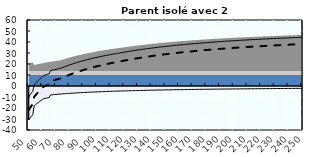
| Category | Coin fiscal moyen (somme des composantes) | Taux moyen d'imposition net en % du salaire brut |
|---|---|---|
| 50.0 | -9.884 | -22.027 |
| 51.0 | -8.051 | -19.991 |
| 52.0 | -6.288 | -18.033 |
| 53.0 | -4.807 | -16.388 |
| 54.0 | 1.073 | -9.859 |
| 55.0 | 2.403 | -8.381 |
| 56.0 | 3.686 | -6.957 |
| 57.0 | 4.924 | -5.582 |
| 58.0 | 6.119 | -4.255 |
| 59.0 | 7.274 | -2.973 |
| 60.0 | 8.39 | -1.733 |
| 61.0 | 9.47 | -0.534 |
| 62.0 | 10.026 | 0.084 |
| 63.0 | 10.432 | 0.535 |
| 64.0 | 10.825 | 0.972 |
| 65.0 | 11.207 | 1.395 |
| 66.0 | 13.945 | 4.436 |
| 67.0 | 14.269 | 4.796 |
| 68.0 | 14.583 | 5.144 |
| 69.0 | 14.888 | 5.483 |
| 70.0 | 15.184 | 5.811 |
| 71.0 | 15.471 | 6.131 |
| 72.0 | 15.751 | 6.442 |
| 73.0 | 16.023 | 6.744 |
| 74.0 | 16.42 | 7.185 |
| 75.0 | 16.916 | 7.736 |
| 76.0 | 17.399 | 8.272 |
| 77.0 | 17.87 | 8.794 |
| 78.0 | 18.328 | 9.303 |
| 79.0 | 18.775 | 9.8 |
| 80.0 | 19.211 | 10.283 |
| 81.0 | 19.635 | 10.755 |
| 82.0 | 20.05 | 11.215 |
| 83.0 | 20.454 | 11.665 |
| 84.0 | 20.849 | 12.103 |
| 85.0 | 21.235 | 12.531 |
| 86.0 | 21.612 | 12.95 |
| 87.0 | 21.98 | 13.358 |
| 88.0 | 22.339 | 13.758 |
| 89.0 | 22.691 | 14.148 |
| 90.0 | 23.034 | 14.53 |
| 91.0 | 23.371 | 14.903 |
| 92.0 | 23.699 | 15.268 |
| 93.0 | 24.021 | 15.625 |
| 94.0 | 24.336 | 15.975 |
| 95.0 | 24.644 | 16.318 |
| 96.0 | 24.946 | 16.653 |
| 97.0 | 25.242 | 16.981 |
| 98.0 | 25.532 | 17.303 |
| 99.0 | 25.815 | 17.618 |
| 100.0 | 26.093 | 17.927 |
| 101.0 | 26.366 | 18.229 |
| 102.0 | 26.633 | 18.526 |
| 103.0 | 26.895 | 18.817 |
| 104.0 | 27.152 | 19.103 |
| 105.0 | 27.404 | 19.383 |
| 106.0 | 27.652 | 19.657 |
| 107.0 | 27.894 | 19.927 |
| 108.0 | 28.133 | 20.191 |
| 109.0 | 28.367 | 20.451 |
| 110.0 | 28.596 | 20.706 |
| 111.0 | 28.822 | 20.956 |
| 112.0 | 29.043 | 21.202 |
| 113.0 | 29.261 | 21.444 |
| 114.0 | 29.474 | 21.681 |
| 115.0 | 29.684 | 21.915 |
| 116.0 | 29.891 | 22.144 |
| 117.0 | 30.095 | 22.371 |
| 118.0 | 30.321 | 22.622 |
| 119.0 | 30.544 | 22.869 |
| 120.0 | 30.762 | 23.112 |
| 121.0 | 30.977 | 23.35 |
| 122.0 | 31.189 | 23.585 |
| 123.0 | 31.397 | 23.816 |
| 124.0 | 31.602 | 24.043 |
| 125.0 | 31.803 | 24.267 |
| 126.0 | 32.001 | 24.487 |
| 127.0 | 32.196 | 24.704 |
| 128.0 | 32.388 | 24.917 |
| 129.0 | 32.577 | 25.127 |
| 130.0 | 32.763 | 25.334 |
| 131.0 | 32.947 | 25.537 |
| 132.0 | 33.127 | 25.738 |
| 133.0 | 33.305 | 25.935 |
| 134.0 | 33.48 | 26.13 |
| 135.0 | 33.653 | 26.321 |
| 136.0 | 33.823 | 26.51 |
| 137.0 | 33.99 | 26.696 |
| 138.0 | 34.155 | 26.88 |
| 139.0 | 34.318 | 27.06 |
| 140.0 | 34.479 | 27.239 |
| 141.0 | 34.637 | 27.414 |
| 142.0 | 34.793 | 27.587 |
| 143.0 | 34.946 | 27.758 |
| 144.0 | 35.098 | 27.926 |
| 145.0 | 35.248 | 28.092 |
| 146.0 | 35.395 | 28.256 |
| 147.0 | 35.54 | 28.418 |
| 148.0 | 35.684 | 28.577 |
| 149.0 | 35.825 | 28.734 |
| 150.0 | 35.965 | 28.889 |
| 151.0 | 36.103 | 29.042 |
| 152.0 | 36.239 | 29.193 |
| 153.0 | 36.373 | 29.342 |
| 154.0 | 36.506 | 29.49 |
| 155.0 | 36.636 | 29.635 |
| 156.0 | 36.766 | 29.778 |
| 157.0 | 36.893 | 29.92 |
| 158.0 | 37.019 | 30.059 |
| 159.0 | 37.143 | 30.197 |
| 160.0 | 37.266 | 30.334 |
| 161.0 | 37.387 | 30.468 |
| 162.0 | 37.507 | 30.601 |
| 163.0 | 37.625 | 30.732 |
| 164.0 | 37.742 | 30.862 |
| 165.0 | 37.857 | 30.99 |
| 166.0 | 37.971 | 31.117 |
| 167.0 | 38.084 | 31.242 |
| 168.0 | 38.195 | 31.365 |
| 169.0 | 38.305 | 31.488 |
| 170.0 | 38.414 | 31.608 |
| 171.0 | 38.521 | 31.727 |
| 172.0 | 38.627 | 31.845 |
| 173.0 | 38.732 | 31.962 |
| 174.0 | 38.836 | 32.077 |
| 175.0 | 38.938 | 32.191 |
| 176.0 | 39.04 | 32.303 |
| 177.0 | 39.14 | 32.415 |
| 178.0 | 39.239 | 32.525 |
| 179.0 | 39.337 | 32.633 |
| 180.0 | 39.434 | 32.741 |
| 181.0 | 39.529 | 32.847 |
| 182.0 | 39.624 | 32.953 |
| 183.0 | 39.718 | 33.057 |
| 184.0 | 39.811 | 33.16 |
| 185.0 | 39.902 | 33.262 |
| 186.0 | 39.993 | 33.362 |
| 187.0 | 40.083 | 33.462 |
| 188.0 | 40.172 | 33.561 |
| 189.0 | 40.259 | 33.658 |
| 190.0 | 40.346 | 33.755 |
| 191.0 | 40.432 | 33.85 |
| 192.0 | 40.518 | 33.945 |
| 193.0 | 40.602 | 34.038 |
| 194.0 | 40.685 | 34.131 |
| 195.0 | 40.768 | 34.223 |
| 196.0 | 40.849 | 34.313 |
| 197.0 | 40.93 | 34.403 |
| 198.0 | 41.01 | 34.492 |
| 199.0 | 41.089 | 34.58 |
| 200.0 | 41.168 | 34.667 |
| 201.0 | 41.246 | 34.753 |
| 202.0 | 41.322 | 34.839 |
| 203.0 | 41.399 | 34.923 |
| 204.0 | 41.474 | 35.007 |
| 205.0 | 41.549 | 35.09 |
| 206.0 | 41.623 | 35.172 |
| 207.0 | 41.696 | 35.253 |
| 208.0 | 41.768 | 35.334 |
| 209.0 | 41.84 | 35.413 |
| 210.0 | 41.911 | 35.492 |
| 211.0 | 41.982 | 35.571 |
| 212.0 | 42.051 | 35.648 |
| 213.0 | 42.121 | 35.725 |
| 214.0 | 42.189 | 35.801 |
| 215.0 | 42.257 | 35.876 |
| 216.0 | 42.324 | 35.951 |
| 217.0 | 42.391 | 36.025 |
| 218.0 | 42.457 | 36.098 |
| 219.0 | 42.522 | 36.171 |
| 220.0 | 42.587 | 36.243 |
| 221.0 | 42.651 | 36.314 |
| 222.0 | 42.715 | 36.385 |
| 223.0 | 42.778 | 36.455 |
| 224.0 | 42.84 | 36.524 |
| 225.0 | 42.902 | 36.593 |
| 226.0 | 42.964 | 36.661 |
| 227.0 | 43.024 | 36.729 |
| 228.0 | 43.085 | 36.796 |
| 229.0 | 43.145 | 36.862 |
| 230.0 | 43.204 | 36.928 |
| 231.0 | 43.263 | 36.993 |
| 232.0 | 43.321 | 37.058 |
| 233.0 | 43.379 | 37.122 |
| 234.0 | 43.436 | 37.185 |
| 235.0 | 43.493 | 37.248 |
| 236.0 | 43.549 | 37.311 |
| 237.0 | 43.605 | 37.373 |
| 238.0 | 43.66 | 37.434 |
| 239.0 | 43.715 | 37.495 |
| 240.0 | 43.769 | 37.556 |
| 241.0 | 43.823 | 37.616 |
| 242.0 | 43.877 | 37.675 |
| 243.0 | 43.93 | 37.734 |
| 244.0 | 43.983 | 37.793 |
| 245.0 | 44.035 | 37.851 |
| 246.0 | 44.087 | 37.908 |
| 247.0 | 44.138 | 37.965 |
| 248.0 | 44.189 | 38.022 |
| 249.0 | 44.239 | 38.078 |
| 250.0 | 44.29 | 38.134 |